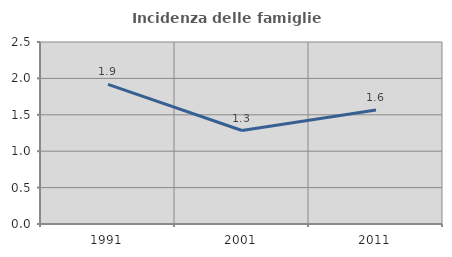
| Category | Incidenza delle famiglie numerose |
|---|---|
| 1991.0 | 1.918 |
| 2001.0 | 1.284 |
| 2011.0 | 1.566 |